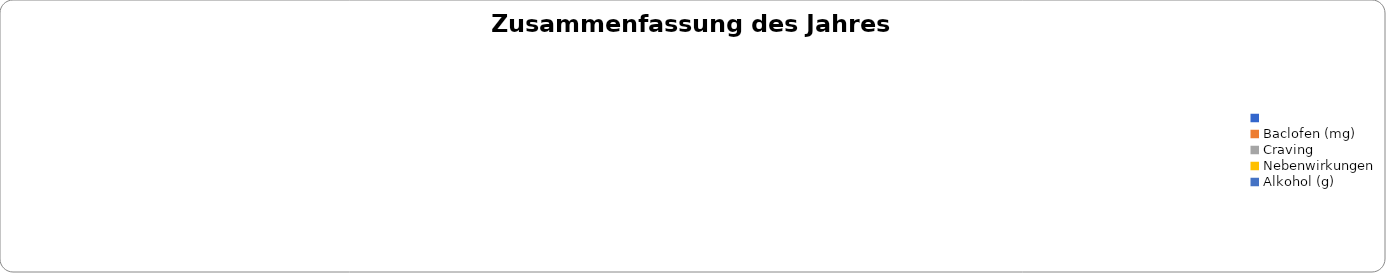
| Category | Series 0 |
|---|---|
|  | 0 |
| Baclofen (mg) | 0 |
| Craving | 0 |
| Nebenwirkungen | 0 |
| Alkohol (g) | 0 |